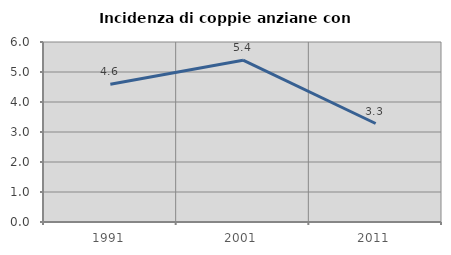
| Category | Incidenza di coppie anziane con figli |
|---|---|
| 1991.0 | 4.593 |
| 2001.0 | 5.393 |
| 2011.0 | 3.283 |